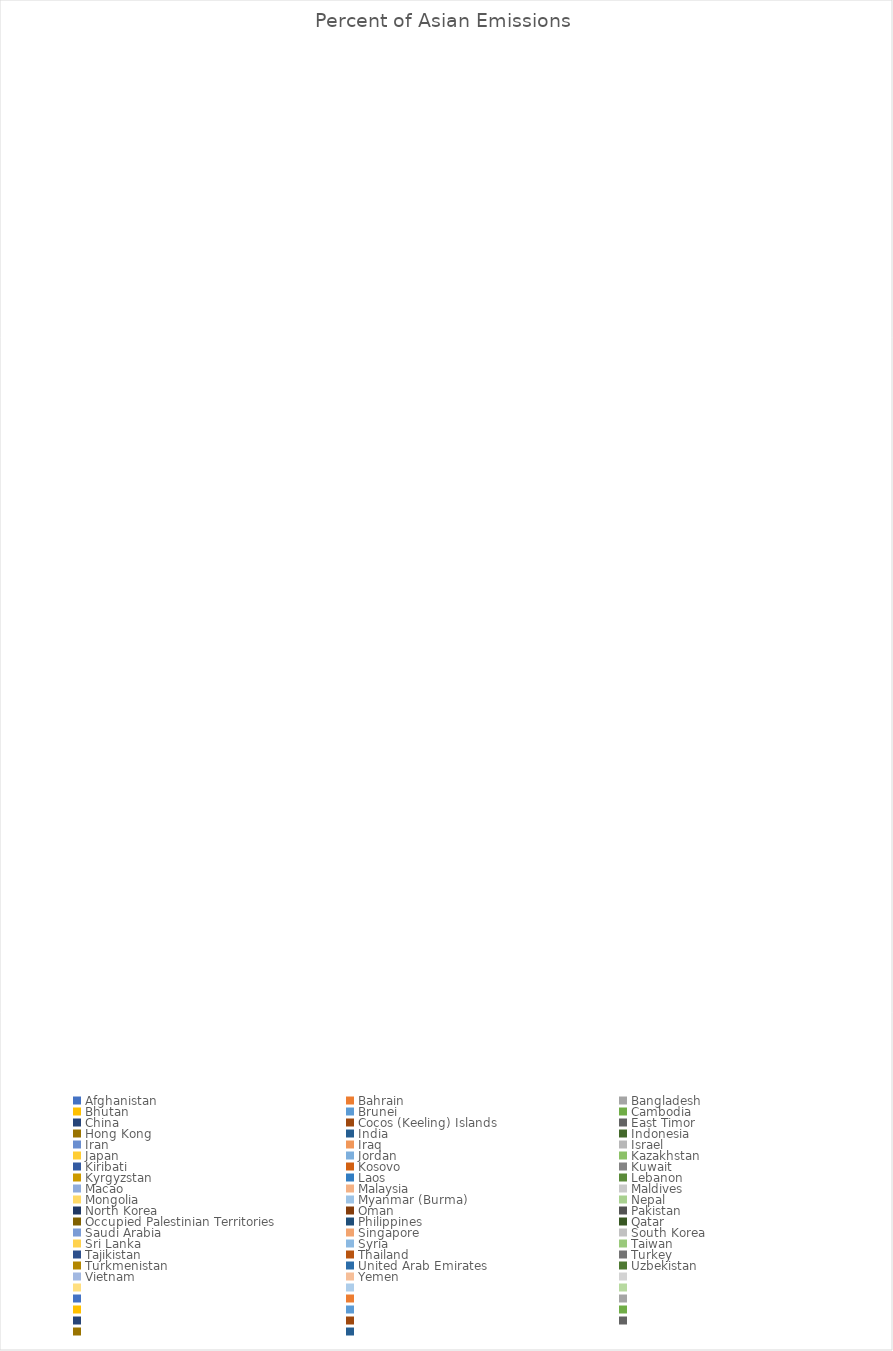
| Category | Percent of Asian Emissions  |
|---|---|
| Afghanistan | 0 |
| Bahrain | 0 |
| Bangladesh | 0 |
| Bhutan | 0 |
| Brunei | 0 |
| Cambodia | 0 |
| China | 0 |
| Cocos (Keeling) Islands | 0 |
| East Timor | 0 |
| Hong Kong | 0 |
| India | 0 |
| Indonesia | 0 |
| Iran | 0 |
| Iraq | 0 |
| Israel | 0 |
| Japan | 0 |
| Jordan | 0 |
| Kazakhstan | 0 |
| Kiribati | 0 |
| Kosovo | 0 |
| Kuwait | 0 |
| Kyrgyzstan | 0 |
| Laos | 0 |
| Lebanon | 0 |
| Macao | 0 |
| Malaysia | 0 |
| Maldives | 0 |
| Mongolia | 0 |
| Myanmar (Burma) | 0 |
| Nepal | 0 |
| North Korea | 0 |
| Oman | 0 |
| Pakistan | 0 |
| Occupied Palestinian Territories | 0 |
| Philippines | 0 |
| Qatar | 0 |
| Saudi Arabia | 0 |
| Singapore | 0 |
| South Korea | 0 |
| Sri Lanka | 0 |
| Syria | 0 |
| Taiwan | 0 |
| Tajikistan | 0 |
| Thailand | 0 |
| Turkey | 0 |
| Turkmenistan | 0 |
| United Arab Emirates | 0 |
| Uzbekistan | 0 |
| Vietnam | 0 |
| Yemen | 0 |